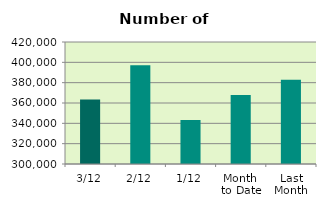
| Category | Series 0 |
|---|---|
| 3/12 | 363482 |
| 2/12 | 397106 |
| 1/12 | 343328 |
| Month 
to Date | 367972 |
| Last
Month | 382855.048 |